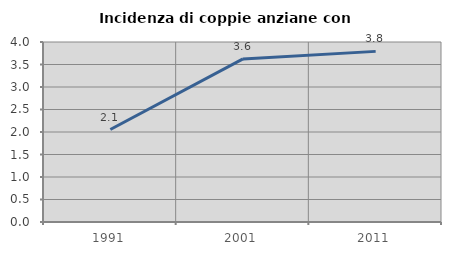
| Category | Incidenza di coppie anziane con figli |
|---|---|
| 1991.0 | 2.055 |
| 2001.0 | 3.624 |
| 2011.0 | 3.792 |